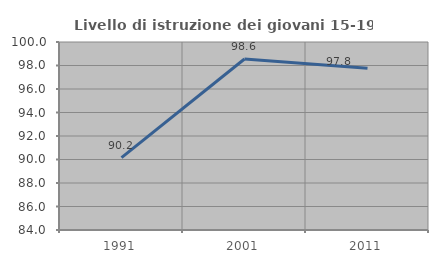
| Category | Livello di istruzione dei giovani 15-19 anni |
|---|---|
| 1991.0 | 90.157 |
| 2001.0 | 98.554 |
| 2011.0 | 97.759 |